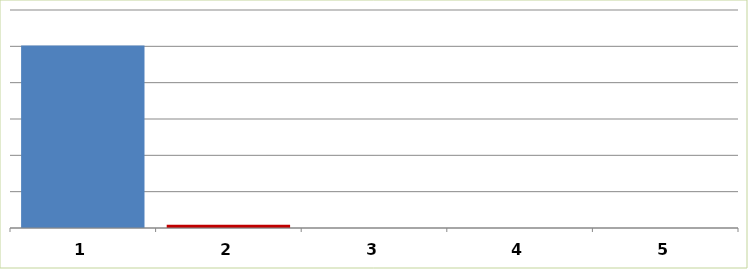
| Category | Series 0 |
|---|---|
| 0 | 5019517 |
| 1 | 90760 |
| 2 | 0 |
| 3 | 0 |
| 4 | 0 |